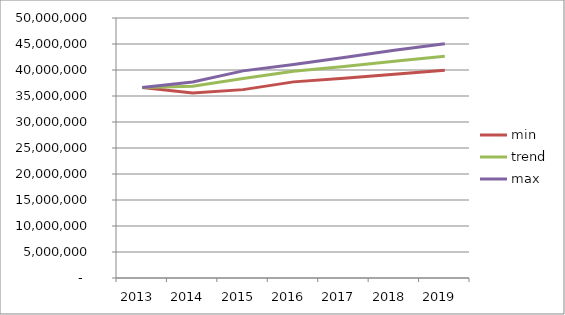
| Category |  min  |  trend  |  max  |
|---|---|---|---|
| 2013.0 | 36612967.789 | 36612967.789 | 36612967.789 |
| 2014.0 | 35578596.294 | 36884006.809 | 37698370.401 |
| 2015.0 | 36225668.291 | 38363299.876 | 39830008.016 |
| 2016.0 | 37715807.178 | 39751584.94 | 41061321.553 |
| 2017.0 | 38429152.504 | 40689386.116 | 42401308.095 |
| 2018.0 | 39195248.518 | 41686700.133 | 43782654.018 |
| 2019.0 | 39948908.129 | 42648206.834 | 45067652.403 |